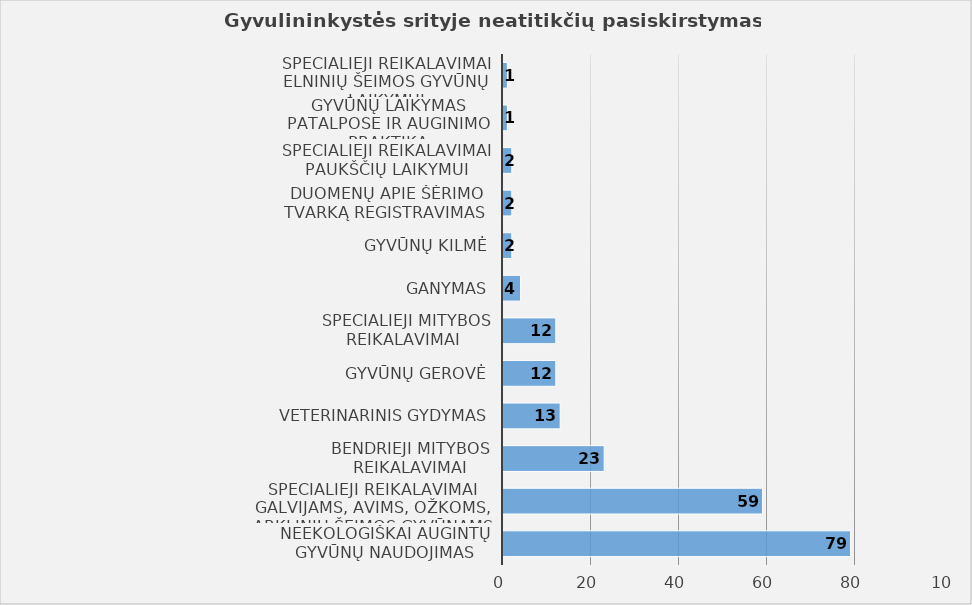
| Category | Series 0 |
|---|---|
| Neekologiškai augintų gyvūnų naudojimas | 79 |
| Specialieji reikalavimai galvijams, avims, ožkoms, arklinių šeimos gyvūnams | 59 |
| Bendrieji mitybos reikalavimai | 23 |
| Veterinarinis gydymas | 13 |
| Gyvūnų gerovė | 12 |
| Specialieji mitybos reikalavimai  | 12 |
| Ganymas | 4 |
| Gyvūnų kilmė | 2 |
| Duomenų apie šėrimo tvarką registravimas  | 2 |
| Specialieji reikalavimai paukščių laikymui | 2 |
| Gyvūnų laikymas patalpose ir auginimo praktika | 1 |
| Specialieji reikalavimai elninių šeimos gyvūnų laikymui | 1 |